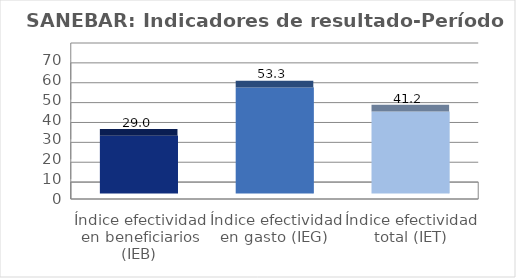
| Category | Series 0 |
|---|---|
| Índice efectividad en beneficiarios (IEB) | 29.032 |
| Índice efectividad en gasto (IEG)  | 53.333 |
| Índice efectividad total (IET) | 41.183 |